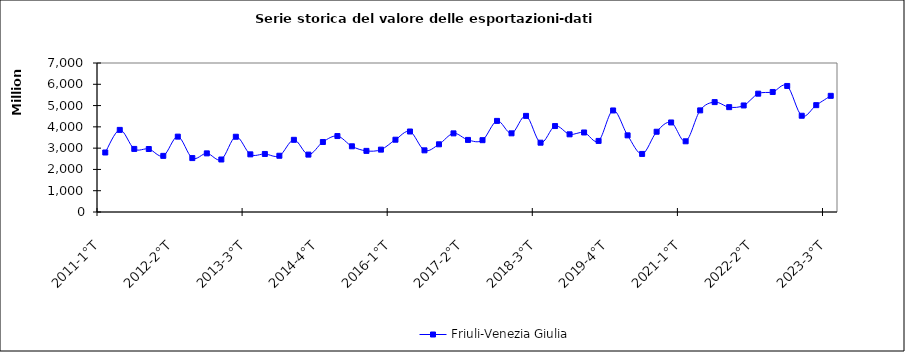
| Category | Friuli-Venezia Giulia  |
|---|---|
| 2011-1°T  | 2795361724 |
| 2011-2°T  | 3856958414 |
| 2011-3°T  | 2962806226 |
| 2011-4°T  | 2959552088 |
| 2012-1°T  | 2637258904 |
| 2012-2°T  | 3541048081 |
| 2012-3°T  | 2532902055 |
| 2012-4°T  | 2754267917 |
| 2013-1°T  | 2466916931 |
| 2013-2°T  | 3534852740 |
| 2013-3°T  | 2708552947 |
| 2013-4°T  | 2726870677 |
| 2014-1°T  | 2642279087 |
| 2014-2°T  | 3390734522 |
| 2014-3°T  | 2695975185 |
| 2014-4°T  | 3289202328 |
| 2015-1°T  | 3568095572 |
| 2015-2°T  | 3087148645 |
| 2015-3°T  | 2871276970 |
| 2015-4°T  | 2930181037 |
| 2016-1°T  | 3396372124 |
| 2016-2°T  | 3781161912 |
| 2016-3°T  | 2896780873 |
| 2016-4°T  | 3180680606 |
| 2017-1°T  | 3694220691 |
| 2017-2°T  | 3386478922 |
| 2017-3°T  | 3374117458 |
| 2017-4°T  | 4279659540 |
| 2018-1°T  | 3695564271 |
| 2018-2°T  | 4515607864 |
| 2018-3°T  | 3255894394 |
| 2018-4°T  | 4037924253 |
| 2019-1°T  | 3649689406 |
| 2019-2°T  | 3735696822 |
| 2019-3°T  | 3339492664 |
| 2019-4°T | 4770583715 |
| 2020-1°T | 3601125111 |
| 2020-2°T | 2727840728 |
| 2020-3°T | 3770816439 |
| 2020-4°T | 4206171566 |
| 2021-1°T | 3322074968 |
| 2021-2°T | 4774318462 |
| 2021-3°T | 5162972216 |
| 2021-4°T | 4925620375 |
| 2022-1°T | 5005154848 |
| 2022-2°T | 5558459874 |
| 2022-3°T | 5638938221 |
| 2022-4°T | 5921172592 |
| 2023-1°T | 4522139927 |
| 2023-2°T | 5019704029 |
| 2023-3°T | 5457583541 |